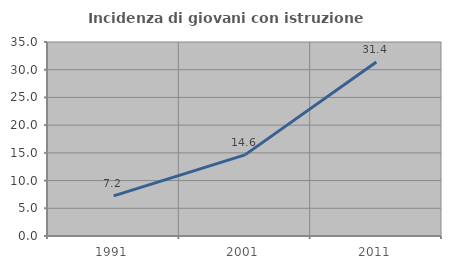
| Category | Incidenza di giovani con istruzione universitaria |
|---|---|
| 1991.0 | 7.246 |
| 2001.0 | 14.634 |
| 2011.0 | 31.387 |